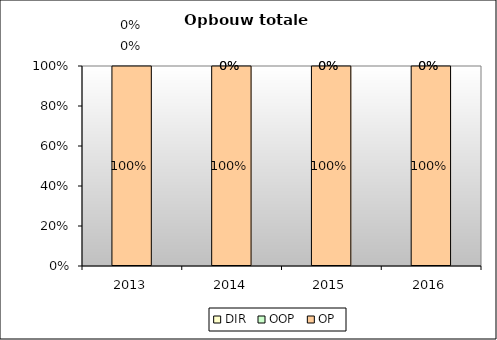
| Category | OP | OOP | DIR |
|---|---|---|---|
| 2013.0 | 1 | 0 | 0 |
| 2014.0 | 1 | 0 | 0 |
| 2015.0 | 1 | 0 | 0 |
| 2016.0 | 1 | 0 | 0 |